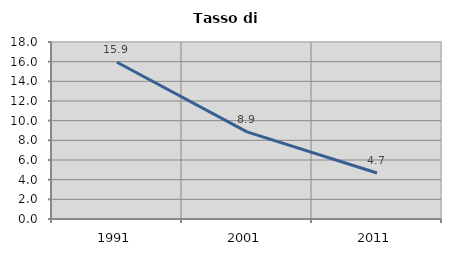
| Category | Tasso di disoccupazione   |
|---|---|
| 1991.0 | 15.942 |
| 2001.0 | 8.861 |
| 2011.0 | 4.678 |